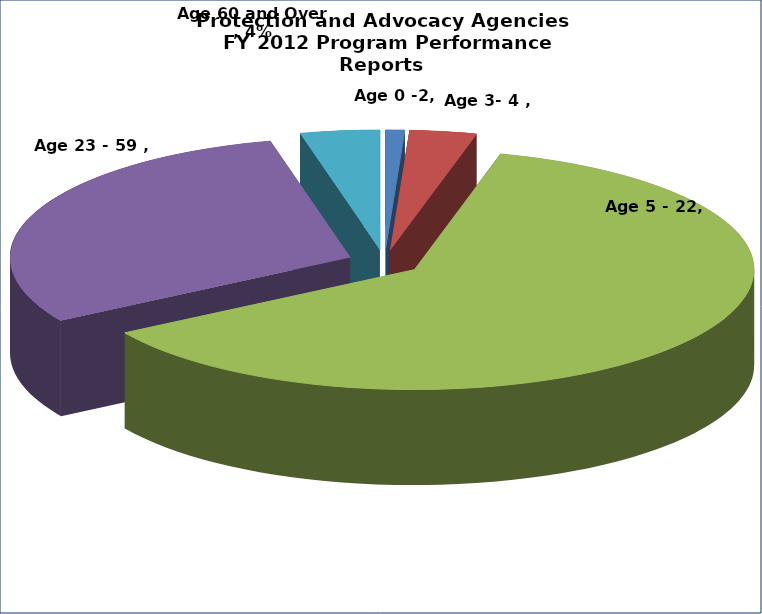
| Category | Series 0 |
|---|---|
| Age 0 -2 | 0.009 |
| Age 3- 4  | 0.032 |
| Age 5 - 22 | 0.621 |
| Age 23 - 59  | 0.301 |
| Age 60 and Over  | 0.038 |